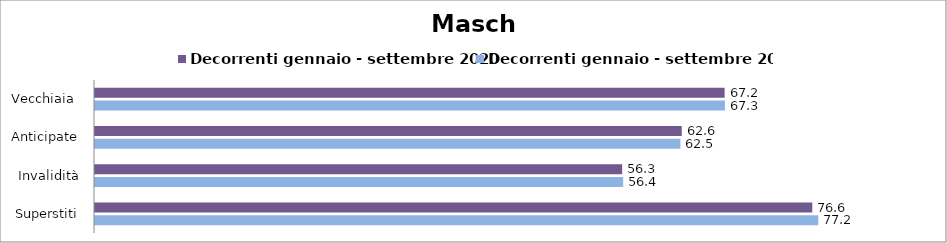
| Category | Decorrenti gennaio - settembre 2020 | Decorrenti gennaio - settembre 2021 |
|---|---|---|
| Vecchiaia  | 67.22 | 67.25 |
| Anticipate | 62.64 | 62.5 |
| Invalidità | 56.28 | 56.39 |
| Superstiti | 76.58 | 77.22 |